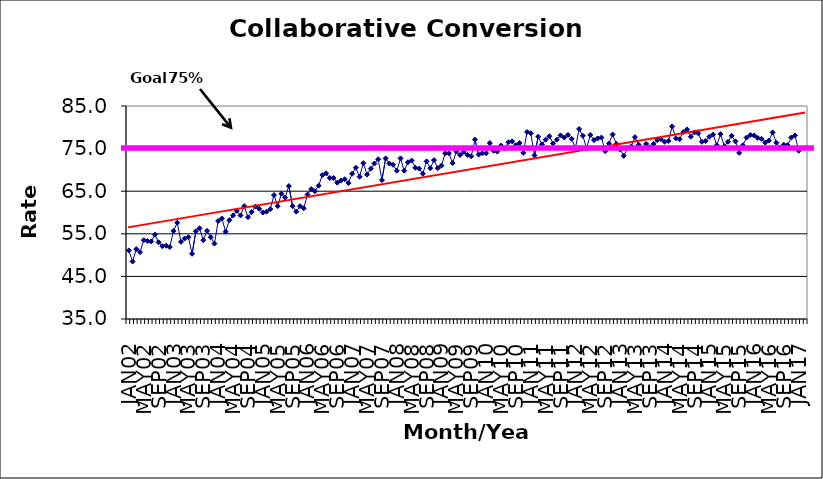
| Category | Series 0 |
|---|---|
| JAN02 | 51.1 |
| FEB02 | 48.5 |
| MAR02 | 51.4 |
| APR02 | 50.7 |
| MAY02 | 53.5 |
| JUN02 | 53.3 |
| JUL02 | 53.2 |
| AUG02 | 54.8 |
| SEP02 | 53 |
| OCT02 | 52.1 |
| NOV02 | 52.2 |
| DEC02 | 51.9 |
| JAN03 | 55.7 |
| FEB03 | 57.6 |
| MAR03 | 53.1 |
| APR03 | 53.9 |
| MAY03 | 54.2 |
| JUN03 | 50.3 |
| JUL03 | 55.6 |
| AUG03 | 56.3 |
| SEP03 | 53.5 |
| OCT03 | 55.7 |
| NOV03 | 54.2 |
| DEC03 | 52.7 |
| JAN04 | 58 |
| FEB04 | 58.6 |
| MAR04 | 55.5 |
| APR04 | 58.2 |
| MAY04 | 59.3 |
| JUN04 | 60.4 |
| JUL04 | 59.3 |
| AUG04 | 61.5 |
| SEP04 | 58.9 |
| OCT04 | 60.1 |
| NOV04 | 61.4 |
| DEC04 | 60.9 |
| JAN05 | 60 |
| FEB05 | 60.2 |
| MAR05 | 60.8 |
| APR05 | 64.1 |
| MAY05 | 61.5 |
| JUN05 | 64.4 |
| JUL05 | 63.5 |
| AUG05 | 66.2 |
| SEP05 | 61.5 |
| OCT05 | 60.2 |
| NOV05 | 61.5 |
| DEC05 | 61 |
| JAN06 | 64.2 |
| FEB06 | 65.5 |
| MAR06 | 65 |
| APR06 | 66.3 |
| MAY06 | 68.8 |
| JUN06 | 69.2 |
| JUL06 | 68.1 |
| AUG06 | 68.1 |
| SEP06 | 67 |
| OCT06 | 67.5 |
| NOV06 | 67.8 |
| DEC06 | 66.9 |
| JAN07 | 69.1 |
| FEB07 | 70.5 |
| MAR07 | 68.4 |
| APR07 | 71.6 |
| MAY07 | 68.9 |
| JUN07 | 70.3 |
| JUL07 | 71.5 |
| AUG07 | 72.5 |
| SEP07 | 67.6 |
| OCT07 | 72.7 |
| NOV07 | 71.5 |
| DEC07 | 71.2 |
| JAN08 | 69.8 |
| FEB08 | 72.7 |
| MAR08 | 69.8 |
| APR08 | 71.8 |
| MAY08 | 72.2 |
| JUN08 | 70.5 |
| JUL08 | 70.3 |
| AUG08 | 69.1 |
| SEP08 | 72 |
| OCT08 | 70.4 |
| NOV08 | 72.3 |
| DEC08 | 70.4 |
| JAN09 | 71 |
| FEB09 | 73.9 |
| MAR09 | 73.9 |
| APR09 | 71.6 |
| MAY09 | 74.3 |
| JUN09 | 73.5 |
| JUL09 | 74.2 |
| AUG09 | 73.5 |
| SEP09 | 73.2 |
| OCT09 | 77.1 |
| NOV09 | 73.6 |
| DEC09 | 73.9 |
| JAN10 | 73.9 |
| FEB10 | 76.3 |
| MAR10 | 74.5 |
| APR10 | 74.3 |
| MAY10 | 75.7 |
| JUN10 | 75 |
| JUL10 | 76.5 |
| AUG10 | 76.7 |
| SEP10 | 75.8 |
| OCT10 | 76.3 |
| NOV10 | 74 |
| DEC10 | 78.9 |
| JAN11 | 78.6 |
| FEB11 | 73.4 |
| MAR11 | 77.8 |
| APR11 | 76 |
| MAY11 | 77.1 |
| JUN11 | 77.9 |
| JUL11 | 76.2 |
| AUG11 | 77.1 |
| SEP11 | 78.1 |
| OCT11 | 77.6 |
| NOV11 | 78.2 |
| DEC11 | 77.3 |
| JAN12 | 75.1 |
| FEB12 | 79.6 |
| MAR12 | 78 |
| APR12 | 75 |
| MAY12 | 78.2 |
| JUN12 | 77 |
| JUL12 | 77.4 |
| AUG12 | 77.6 |
| SEP12 | 74.4 |
| OCT12 | 76.2 |
| NOV12 | 78.3 |
| DEC12 | 76.1 |
| JAN13 | 74.8 |
| FEB13 | 73.3 |
| MAR13 | 75.1 |
| APR13 | 75.5 |
| MAY13 | 77.7 |
| JUN13 | 75.9 |
| JUL13 | 75 |
| AUG13 | 76.1 |
| SEP13 | 75.3 |
| OCT13 | 76.1 |
| NOV13 | 77 |
| DEC13 | 77.2 |
| JAN14 | 76.6 |
| FEB14 | 76.8 |
| MAR14 | 80.2 |
| APR14 | 77.4 |
| MAY14 | 77.2 |
| JUN14 | 78.9 |
| JUL14 | 79.5 |
| AUG14 | 77.8 |
| SEP14 | 78.8 |
| OCT14 | 78.6 |
| NOV14 | 76.6 |
| DEC14 | 76.8 |
| JAN15 | 77.8 |
| FEB15 | 78.3 |
| MAR15 | 75.8 |
| APR15 | 78.4 |
| MAY15 | 75.6 |
| JUN15 | 76.6 |
| JUL15 | 78 |
| AUG15 | 76.7 |
| SEP15 | 74 |
| OCT15 | 75.8 |
| NOV15 | 77.6 |
| DEC15 | 78.2 |
| JAN16 | 78.1 |
| FEB16 | 77.5 |
| MAR16 | 77.3 |
| APR16 | 76.4 |
| MAY16 | 76.9 |
| JUN16 | 78.8 |
| JUL16 | 76.4 |
| AUG16 | 75.2 |
| SEP16 | 75.9 |
| OCT16 | 75.8 |
| NOV16 | 77.6 |
| DEC16 | 78.1 |
| JAN17 | 74.5 |